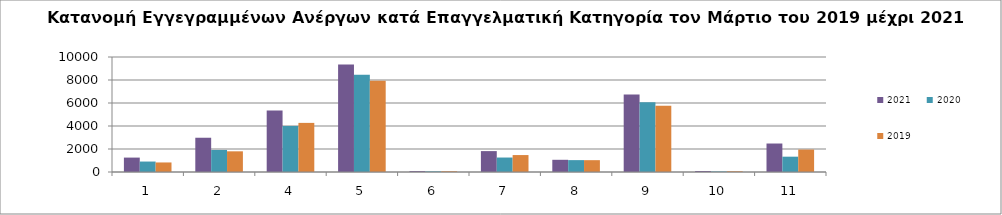
| Category | 2021 | 2020 | 2019 |
|---|---|---|---|
| 1.0 | 1253 | 909 | 830 |
| 2.0 | 2979 | 1918 | 1798 |
| 4.0 | 5349 | 4001 | 4271 |
| 5.0 | 9340 | 8454 | 7939 |
| 6.0 | 79 | 54 | 65 |
| 7.0 | 1817 | 1258 | 1473 |
| 8.0 | 1061 | 1033 | 1029 |
| 9.0 | 6741 | 6062 | 5771 |
| 10.0 | 86 | 44 | 64 |
| 11.0 | 2477 | 1332 | 1952 |